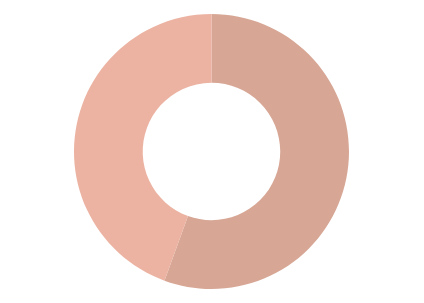
| Category | Series 0 |
|---|---|
| 0 | 0.556 |
| 1 | 0.444 |